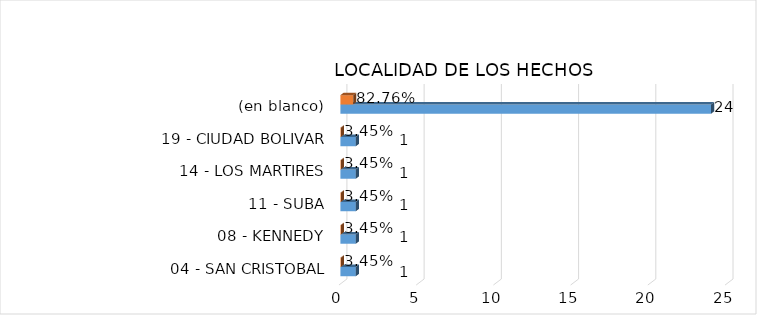
| Category | Cuenta de Número petición | Cuenta de Número petición2 |
|---|---|---|
| 04 - SAN CRISTOBAL | 1 | 0.034 |
| 08 - KENNEDY | 1 | 0.034 |
| 11 - SUBA | 1 | 0.034 |
| 14 - LOS MARTIRES | 1 | 0.034 |
| 19 - CIUDAD BOLIVAR | 1 | 0.034 |
| (en blanco) | 24 | 0.828 |